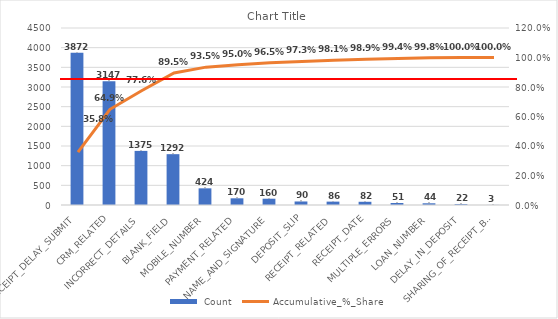
| Category |  Count |
|---|---|
| RECEIPT_DELAY_SUBMIT | 3871.56 |
| CRM_RELATED | 3146.88 |
| INCORRECT_DETAILS | 1375.44 |
| BLANK_FIELD | 1292.28 |
| MOBILE_NUMBER | 423.72 |
| PAYMENT_RELATED | 170.28 |
| NAME_AND_SIGNATURE | 159.72 |
| DEPOSIT_SLIP | 89.76 |
| RECEIPT_RELATED | 85.8 |
| RECEIPT_DATE | 81.84 |
| MULTIPLE_ERRORS | 51.48 |
| LOAN_NUMBER | 43.56 |
| DELAY_IN_DEPOSIT | 22.44 |
| SHARING_OF_RECEIPT_BOOK | 2.64 |